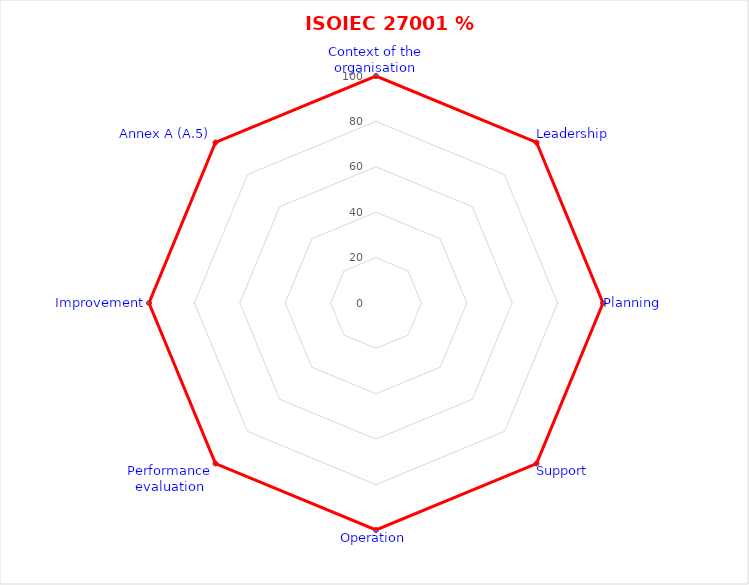
| Category | % Compliance |
|---|---|
| Context of the organisation | 100 |
| Leadership | 100 |
| Planning | 100 |
| Support | 100 |
| Operation | 100 |
| Performance evaluation | 100 |
| Improvement | 100 |
| Annex A (A.5) | 100 |